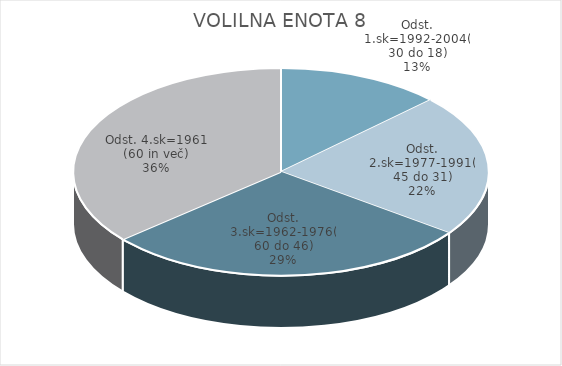
| Category | VOLILNA ENOTA 8 |
|---|---|
| Odst. 1.sk=1992-2004(30 do 18) | 8.26 |
| Odst. 2.sk=1977-1991(45 do 31) | 14.36 |
| Odst. 3.sk=1962-1976(60 do 46) | 18.54 |
| Odst. 4.sk=1961 (60 in več) | 23.41 |